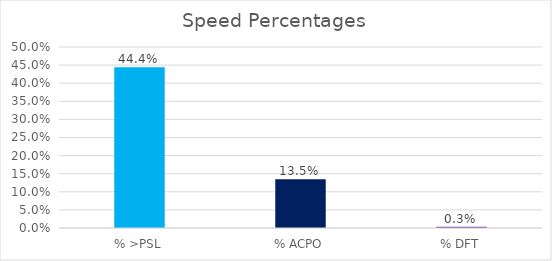
| Category | Series 0 |
|---|---|
| % >PSL | 0.444 |
| % ACPO | 0.135 |
| % DFT | 0.003 |